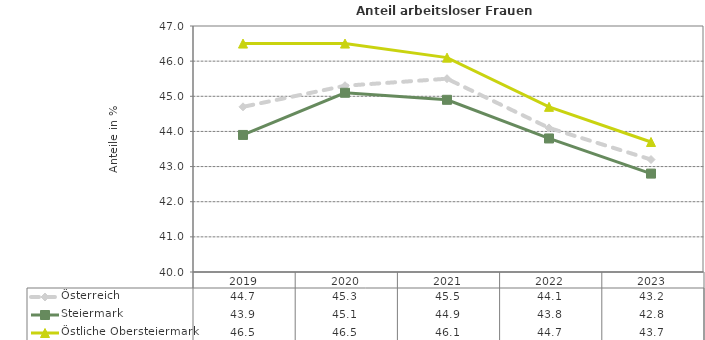
| Category | Österreich | Steiermark | Östliche Obersteiermark |
|---|---|---|---|
| 2023.0 | 43.2 | 42.8 | 43.7 |
| 2022.0 | 44.1 | 43.8 | 44.7 |
| 2021.0 | 45.5 | 44.9 | 46.1 |
| 2020.0 | 45.3 | 45.1 | 46.5 |
| 2019.0 | 44.7 | 43.9 | 46.5 |